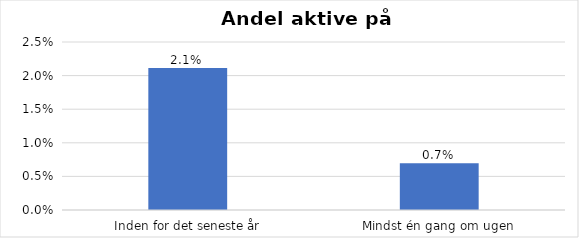
| Category | % |
|---|---|
| Inden for det seneste år | 0.021 |
| Mindst én gang om ugen | 0.007 |